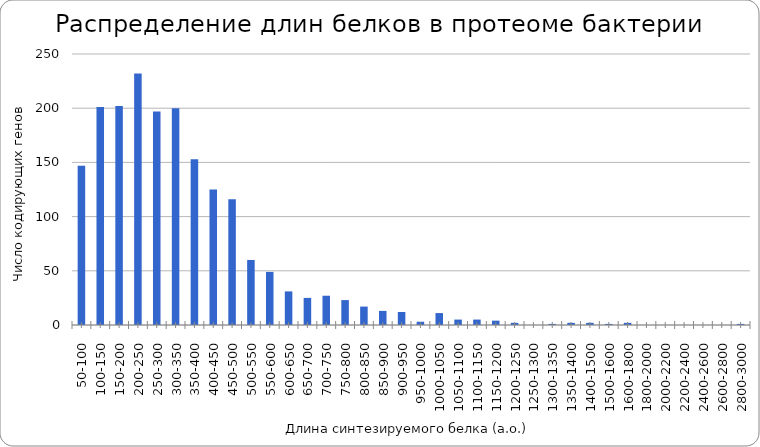
| Category | Series 0 |
|---|---|
| 50-100 | 147 |
| 100-150 | 201 |
| 150-200 | 202 |
| 200-250 | 232 |
| 250-300 | 197 |
| 300-350 | 200 |
| 350-400 | 153 |
| 400-450 | 125 |
| 450-500 | 116 |
| 500-550 | 60 |
| 550-600 | 49 |
| 600-650 | 31 |
| 650-700 | 25 |
| 700-750 | 27 |
| 750-800 | 23 |
| 800-850 | 17 |
| 850-900 | 13 |
| 900-950 | 12 |
| 950-1000 | 3 |
| 1000-1050 | 11 |
| 1050-1100 | 5 |
| 1100-1150 | 5 |
| 1150-1200 | 4 |
| 1200-1250 | 2 |
| 1250-1300 | 0 |
| 1300-1350 | 1 |
| 1350-1400 | 2 |
| 1400-1500 | 2 |
| 1500-1600 | 1 |
| 1600-1800 | 2 |
| 1800-2000 | 0 |
| 2000-2200 | 0 |
| 2200-2400 | 0 |
| 2400-2600 | 0 |
| 2600-2800 | 0 |
| 2800-3000 | 1 |